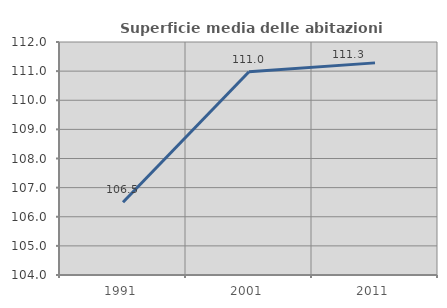
| Category | Superficie media delle abitazioni occupate |
|---|---|
| 1991.0 | 106.497 |
| 2001.0 | 110.98 |
| 2011.0 | 111.283 |